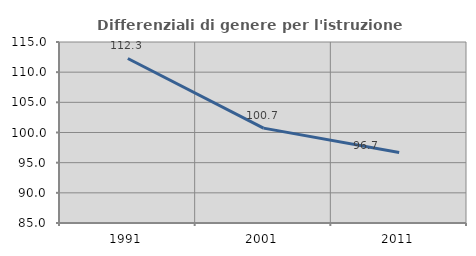
| Category | Differenziali di genere per l'istruzione superiore |
|---|---|
| 1991.0 | 112.272 |
| 2001.0 | 100.727 |
| 2011.0 | 96.671 |